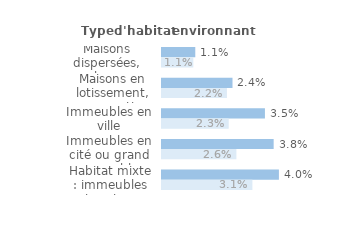
| Category | Series 1 | Series 0 |
|---|---|---|
| Maisons dispersées, hors agglomération | 0.011 | 0.011 |
| Maisons en lotissement, en quartier pavillonnaire | 0.024 | 0.022 |
| Immeubles en ville | 0.035 | 0.023 |
| Immeubles en cité ou grand ensemble | 0.038 | 0.026 |
| Habitat mixte : immeubles et maisons | 0.04 | 0.031 |